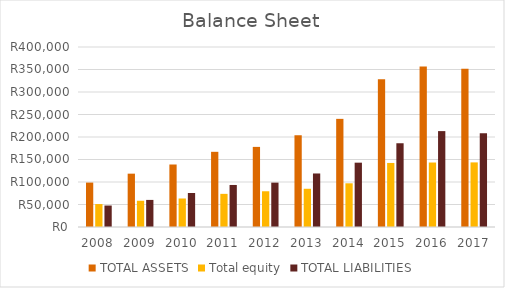
| Category | TOTAL ASSETS | Total equity | TOTAL LIABILITIES |
|---|---|---|---|
| 2008.0 | 98686 | 50961 | 47725 |
| 2009.0 | 118534 | 58334 | 60200 |
| 2010.0 | 138885 | 63347 | 75538 |
| 2011.0 | 167070 | 73666 | 93404 |
| 2012.0 | 178005 | 79421 | 98584 |
| 2013.0 | 203896 | 84954 | 118942 |
| 2014.0 | 240311 | 97113 | 142960 |
| 2015.0 | 328439 | 142328 | 186111 |
| 2016.0 | 356393 | 143290 | 213103 |
| 2017.0 | 351635 | 143563 | 208072 |